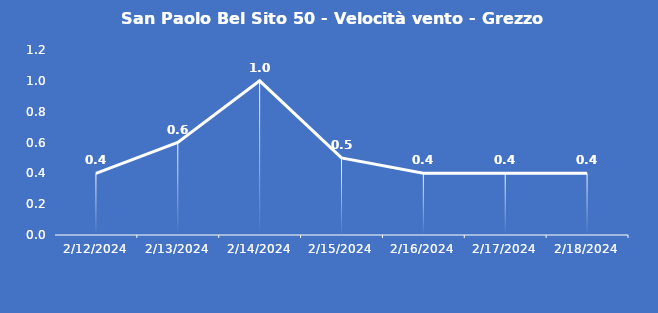
| Category | San Paolo Bel Sito 50 - Velocità vento - Grezzo (m/s) |
|---|---|
| 2/12/24 | 0.4 |
| 2/13/24 | 0.6 |
| 2/14/24 | 1 |
| 2/15/24 | 0.5 |
| 2/16/24 | 0.4 |
| 2/17/24 | 0.4 |
| 2/18/24 | 0.4 |